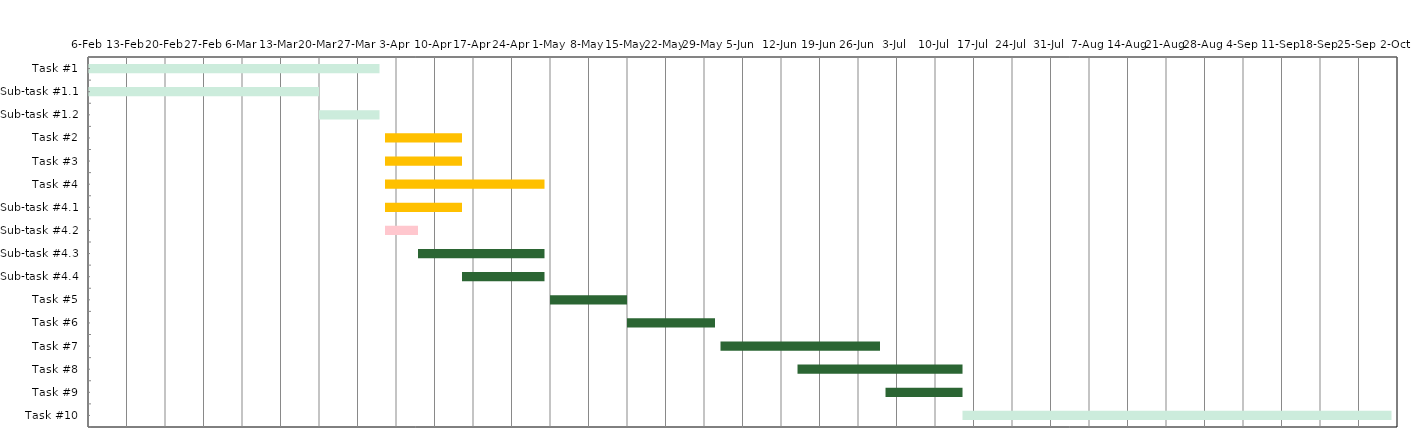
| Category | Start date | Task Duration (days) |
|---|---|---|
| Task #1 | 2023-02-06 | 53 |
| Sub-task #1.1 | 2023-02-06 | 42 |
| Sub-task #1.2 | 2023-03-20 | 11 |
| Task #2 | 2023-04-01 | 14 |
| Task #3 | 2023-04-01 | 14 |
| Task #4 | 2023-04-01 | 29 |
| Sub-task #4.1 | 2023-04-01 | 14 |
| Sub-task #4.2 | 2023-04-01 | 6 |
| Sub-task #4.3 | 2023-04-07 | 23 |
| Sub-task #4.4 | 2023-04-15 | 15 |
| Task #5 | 2023-05-01 | 14 |
| Task #6 | 2023-05-15 | 16 |
| Task #7 | 2023-06-01 | 29 |
| Task #8 | 2023-06-15 | 30 |
| Task #9 | 2023-07-01 | 14 |
| Task #10 | 2023-07-15 | 78 |